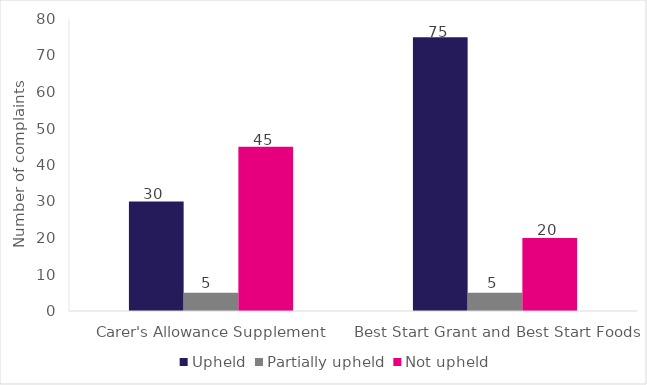
| Category | Upheld | Partially upheld | Not upheld |
|---|---|---|---|
| Carer's Allowance Supplement | 30 | 5 | 45 |
| Best Start Grant and Best Start Foods | 75 | 5 | 20 |